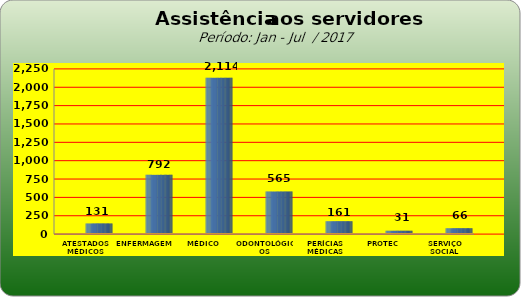
| Category | Series 0 |
|---|---|
| ATESTADOS MÉDICOS | 131 |
| ENFERMAGEM | 792 |
| MÉDICO | 2114 |
| ODONTOLÓGICOS | 565 |
| PERÍCIAS MÉDICAS | 161 |
| PROTEC | 31 |
| SERVIÇO SOCIAL | 66 |